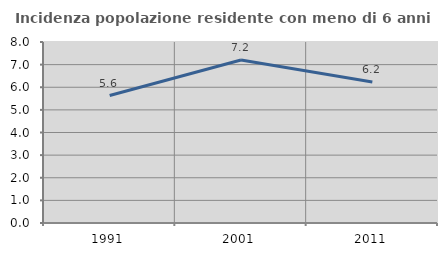
| Category | Incidenza popolazione residente con meno di 6 anni |
|---|---|
| 1991.0 | 5.633 |
| 2001.0 | 7.203 |
| 2011.0 | 6.235 |